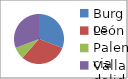
| Category | Series 0 |
|---|---|
| Burgos | 4 |
| León | 4 |
| Palencia | 1 |
| Valladolid | 4 |